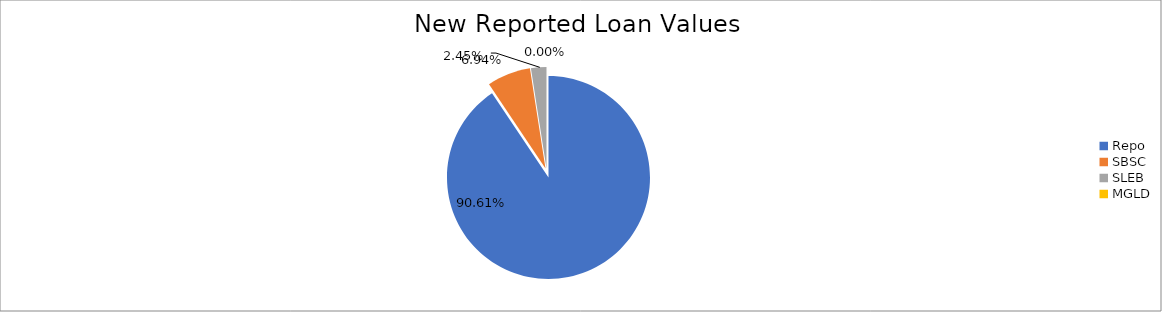
| Category | Series 0 |
|---|---|
| Repo | 9270750.695 |
| SBSC | 709560.182 |
| SLEB | 251086.867 |
| MGLD | 124.388 |